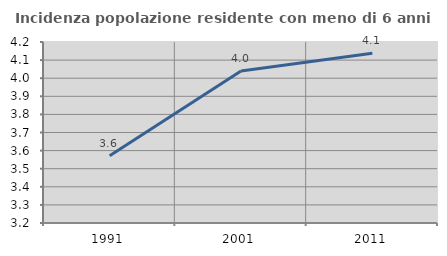
| Category | Incidenza popolazione residente con meno di 6 anni |
|---|---|
| 1991.0 | 3.571 |
| 2001.0 | 4.04 |
| 2011.0 | 4.138 |